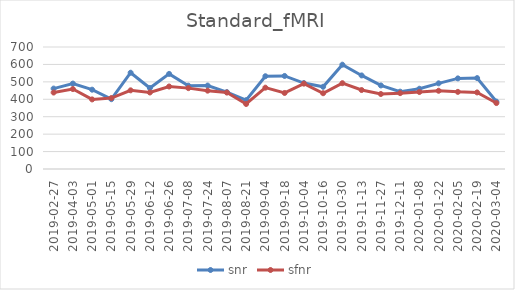
| Category | snr | sfnr |
|---|---|---|
| 2019-02-27 | 461.432 | 438.729 |
| 2019-04-03 | 490.146 | 458.722 |
| 2019-05-01 | 455.075 | 399.248 |
| 2019-05-15 | 400.65 | 407.241 |
| 2019-05-29 | 552.399 | 451.379 |
| 2019-06-12 | 464.698 | 439.009 |
| 2019-06-26 | 545.666 | 473.433 |
| 2019-07-08 | 478.159 | 464.034 |
| 2019-07-24 | 478.738 | 449.484 |
| 2019-08-07 | 441.214 | 438.544 |
| 2019-08-21 | 394.793 | 373.033 |
| 2019-09-04 | 532.233 | 466.613 |
| 2019-09-18 | 533.837 | 436.23 |
| 2019-10-04 | 493.005 | 489.764 |
| 2019-10-16 | 471.715 | 434.766 |
| 2019-10-30 | 598.517 | 492.395 |
| 2019-11-13 | 536.842 | 453.083 |
| 2019-11-27 | 479.42 | 430.281 |
| 2019-12-11 | 443.791 | 435.315 |
| 2020-01-08 | 460.467 | 441.715 |
| 2020-01-22 | 491.578 | 448.905 |
| 2020-02-05 | 519.903 | 442.596 |
| 2020-02-19 | 521.603 | 439.303 |
| 2020-03-04 | 386.86 | 378.362 |